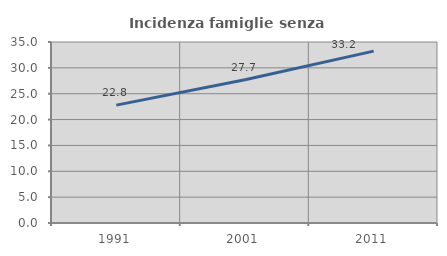
| Category | Incidenza famiglie senza nuclei |
|---|---|
| 1991.0 | 22.797 |
| 2001.0 | 27.691 |
| 2011.0 | 33.241 |